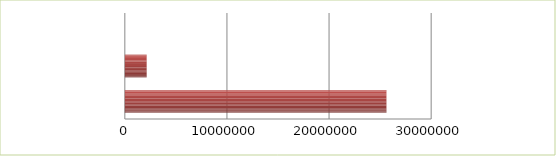
| Category | Series 0 | Series 1 |
|---|---|---|
| 0 | 2.5 | 25620284 |
| 1 | 2.6 | 2138716 |
| 2 | 2.7 | 0 |